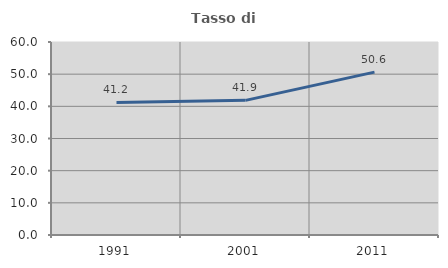
| Category | Tasso di occupazione   |
|---|---|
| 1991.0 | 41.207 |
| 2001.0 | 41.855 |
| 2011.0 | 50.637 |